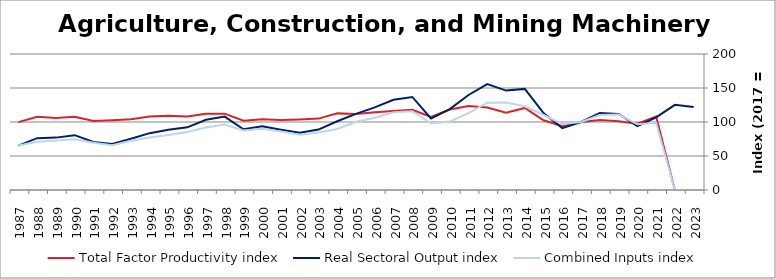
| Category | Total Factor Productivity index | Real Sectoral Output index | Combined Inputs index |
|---|---|---|---|
| 2023.0 | 0 | 122.193 | 0 |
| 2022.0 | 0 | 125.263 | 0 |
| 2021.0 | 108.012 | 106.848 | 98.922 |
| 2020.0 | 97.374 | 94.127 | 96.666 |
| 2019.0 | 100.94 | 111.942 | 110.899 |
| 2018.0 | 102.897 | 113.343 | 110.152 |
| 2017.0 | 100 | 100 | 100 |
| 2016.0 | 93.674 | 91.055 | 97.204 |
| 2015.0 | 102.472 | 113.031 | 110.305 |
| 2014.0 | 120.703 | 148.693 | 123.189 |
| 2013.0 | 113.714 | 146.219 | 128.585 |
| 2012.0 | 121.254 | 155.801 | 128.491 |
| 2011.0 | 123.642 | 139.708 | 112.994 |
| 2010.0 | 118.323 | 119.005 | 100.577 |
| 2009.0 | 107.419 | 105.273 | 98.003 |
| 2008.0 | 118.018 | 136.838 | 115.946 |
| 2007.0 | 116.15 | 132.784 | 114.321 |
| 2006.0 | 114.193 | 121.437 | 106.344 |
| 2005.0 | 111.715 | 111.998 | 100.253 |
| 2004.0 | 112.681 | 101.051 | 89.679 |
| 2003.0 | 105.008 | 88.82 | 84.584 |
| 2002.0 | 103.846 | 84.251 | 81.131 |
| 2001.0 | 103.112 | 88.669 | 85.993 |
| 2000.0 | 103.912 | 93.603 | 90.079 |
| 1999.0 | 101.893 | 89.326 | 87.666 |
| 1998.0 | 112.285 | 107.944 | 96.134 |
| 1997.0 | 112.216 | 103.2 | 91.966 |
| 1996.0 | 108.206 | 92.155 | 85.166 |
| 1995.0 | 109.166 | 88.439 | 81.013 |
| 1994.0 | 108.171 | 83.598 | 77.283 |
| 1993.0 | 104.086 | 75.41 | 72.45 |
| 1992.0 | 102.663 | 67.684 | 65.929 |
| 1991.0 | 101.379 | 70.547 | 69.588 |
| 1990.0 | 107.835 | 80.64 | 74.781 |
| 1989.0 | 105.912 | 77.031 | 72.731 |
| 1988.0 | 107.57 | 76.263 | 70.897 |
| 1987.0 | 99.809 | 65.339 | 65.464 |